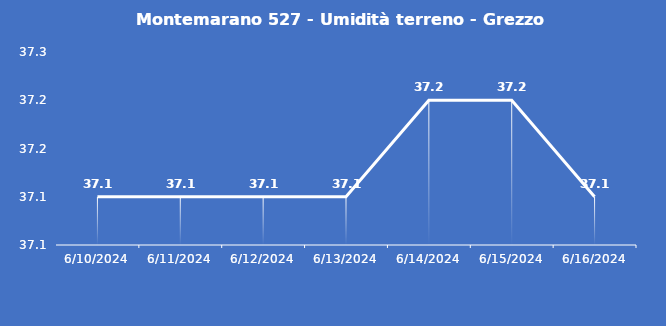
| Category | Montemarano 527 - Umidità terreno - Grezzo (%VWC) |
|---|---|
| 6/10/24 | 37.1 |
| 6/11/24 | 37.1 |
| 6/12/24 | 37.1 |
| 6/13/24 | 37.1 |
| 6/14/24 | 37.2 |
| 6/15/24 | 37.2 |
| 6/16/24 | 37.1 |